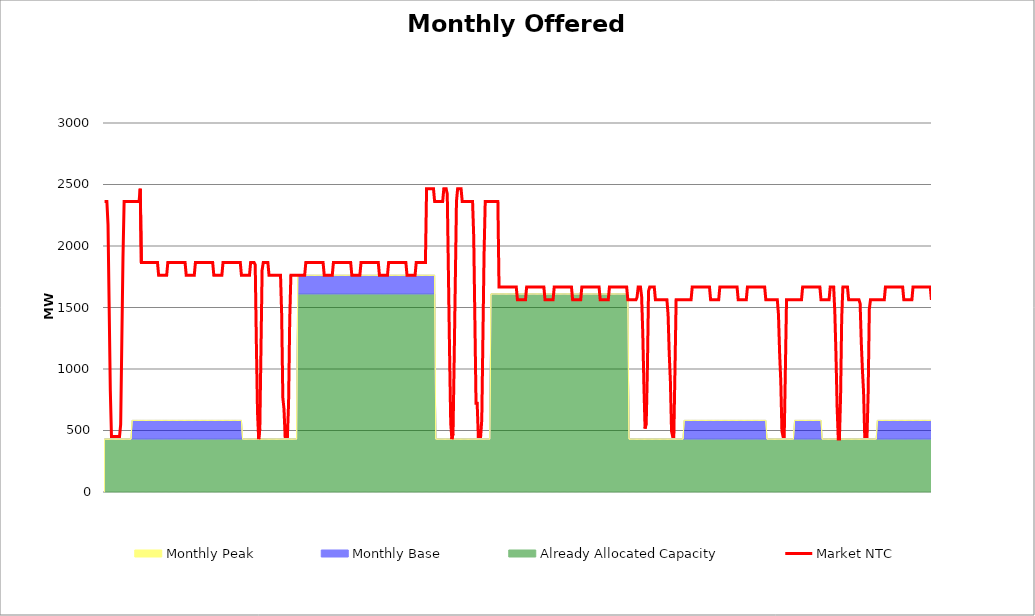
| Category | Market NTC |
|---|---|
| 0 | 2362 |
| 1 | 2362 |
| 2 | 2362 |
| 3 | 2174 |
| 4 | 1497 |
| 5 | 821 |
| 6 | 451 |
| 7 | 451 |
| 8 | 451 |
| 9 | 451 |
| 10 | 451 |
| 11 | 451 |
| 12 | 451 |
| 13 | 451 |
| 14 | 550 |
| 15 | 1227 |
| 16 | 1903 |
| 17 | 2362 |
| 18 | 2362 |
| 19 | 2362 |
| 20 | 2362 |
| 21 | 2362 |
| 22 | 2362 |
| 23 | 2362 |
| 24 | 2362 |
| 25 | 2362 |
| 26 | 2362 |
| 27 | 2362 |
| 28 | 2362 |
| 29 | 2362 |
| 30 | 2362 |
| 31 | 2466 |
| 32 | 1866 |
| 33 | 1866 |
| 34 | 1866 |
| 35 | 1866 |
| 36 | 1866 |
| 37 | 1866 |
| 38 | 1866 |
| 39 | 1866 |
| 40 | 1866 |
| 41 | 1866 |
| 42 | 1866 |
| 43 | 1866 |
| 44 | 1866 |
| 45 | 1866 |
| 46 | 1866 |
| 47 | 1762 |
| 48 | 1762 |
| 49 | 1762 |
| 50 | 1762 |
| 51 | 1762 |
| 52 | 1762 |
| 53 | 1762 |
| 54 | 1762 |
| 55 | 1866 |
| 56 | 1866 |
| 57 | 1866 |
| 58 | 1866 |
| 59 | 1866 |
| 60 | 1866 |
| 61 | 1866 |
| 62 | 1866 |
| 63 | 1866 |
| 64 | 1866 |
| 65 | 1866 |
| 66 | 1866 |
| 67 | 1866 |
| 68 | 1866 |
| 69 | 1866 |
| 70 | 1866 |
| 71 | 1762 |
| 72 | 1762 |
| 73 | 1762 |
| 74 | 1762 |
| 75 | 1762 |
| 76 | 1762 |
| 77 | 1762 |
| 78 | 1762 |
| 79 | 1866 |
| 80 | 1866 |
| 81 | 1866 |
| 82 | 1866 |
| 83 | 1866 |
| 84 | 1866 |
| 85 | 1866 |
| 86 | 1866 |
| 87 | 1866 |
| 88 | 1866 |
| 89 | 1866 |
| 90 | 1866 |
| 91 | 1866 |
| 92 | 1866 |
| 93 | 1866 |
| 94 | 1866 |
| 95 | 1762 |
| 96 | 1762 |
| 97 | 1762 |
| 98 | 1762 |
| 99 | 1762 |
| 100 | 1762 |
| 101 | 1762 |
| 102 | 1762 |
| 103 | 1866 |
| 104 | 1866 |
| 105 | 1866 |
| 106 | 1866 |
| 107 | 1866 |
| 108 | 1866 |
| 109 | 1866 |
| 110 | 1866 |
| 111 | 1866 |
| 112 | 1866 |
| 113 | 1866 |
| 114 | 1866 |
| 115 | 1866 |
| 116 | 1866 |
| 117 | 1866 |
| 118 | 1866 |
| 119 | 1762 |
| 120 | 1762 |
| 121 | 1762 |
| 122 | 1762 |
| 123 | 1762 |
| 124 | 1762 |
| 125 | 1762 |
| 126 | 1762 |
| 127 | 1866 |
| 128 | 1866 |
| 129 | 1866 |
| 130 | 1866 |
| 131 | 1848 |
| 132 | 1203 |
| 133 | 645 |
| 134 | 430 |
| 135 | 516 |
| 136 | 1160 |
| 137 | 1805 |
| 138 | 1866 |
| 139 | 1866 |
| 140 | 1866 |
| 141 | 1866 |
| 142 | 1866 |
| 143 | 1762 |
| 144 | 1762 |
| 145 | 1762 |
| 146 | 1762 |
| 147 | 1762 |
| 148 | 1762 |
| 149 | 1762 |
| 150 | 1762 |
| 151 | 1762 |
| 152 | 1762 |
| 153 | 1762 |
| 154 | 1443 |
| 155 | 767 |
| 156 | 676 |
| 157 | 451 |
| 158 | 451 |
| 159 | 451 |
| 160 | 721 |
| 161 | 1398 |
| 162 | 1762 |
| 163 | 1762 |
| 164 | 1762 |
| 165 | 1762 |
| 166 | 1762 |
| 167 | 1762 |
| 168 | 1762 |
| 169 | 1762 |
| 170 | 1762 |
| 171 | 1762 |
| 172 | 1762 |
| 173 | 1762 |
| 174 | 1762 |
| 175 | 1866 |
| 176 | 1866 |
| 177 | 1866 |
| 178 | 1866 |
| 179 | 1866 |
| 180 | 1866 |
| 181 | 1866 |
| 182 | 1866 |
| 183 | 1866 |
| 184 | 1866 |
| 185 | 1866 |
| 186 | 1866 |
| 187 | 1866 |
| 188 | 1866 |
| 189 | 1866 |
| 190 | 1866 |
| 191 | 1762 |
| 192 | 1762 |
| 193 | 1762 |
| 194 | 1762 |
| 195 | 1762 |
| 196 | 1762 |
| 197 | 1762 |
| 198 | 1762 |
| 199 | 1866 |
| 200 | 1866 |
| 201 | 1866 |
| 202 | 1866 |
| 203 | 1866 |
| 204 | 1866 |
| 205 | 1866 |
| 206 | 1866 |
| 207 | 1866 |
| 208 | 1866 |
| 209 | 1866 |
| 210 | 1866 |
| 211 | 1866 |
| 212 | 1866 |
| 213 | 1866 |
| 214 | 1866 |
| 215 | 1762 |
| 216 | 1762 |
| 217 | 1762 |
| 218 | 1762 |
| 219 | 1762 |
| 220 | 1762 |
| 221 | 1762 |
| 222 | 1762 |
| 223 | 1866 |
| 224 | 1866 |
| 225 | 1866 |
| 226 | 1866 |
| 227 | 1866 |
| 228 | 1866 |
| 229 | 1866 |
| 230 | 1866 |
| 231 | 1866 |
| 232 | 1866 |
| 233 | 1866 |
| 234 | 1866 |
| 235 | 1866 |
| 236 | 1866 |
| 237 | 1866 |
| 238 | 1866 |
| 239 | 1762 |
| 240 | 1762 |
| 241 | 1762 |
| 242 | 1762 |
| 243 | 1762 |
| 244 | 1762 |
| 245 | 1762 |
| 246 | 1762 |
| 247 | 1866 |
| 248 | 1866 |
| 249 | 1866 |
| 250 | 1866 |
| 251 | 1866 |
| 252 | 1866 |
| 253 | 1866 |
| 254 | 1866 |
| 255 | 1866 |
| 256 | 1866 |
| 257 | 1866 |
| 258 | 1866 |
| 259 | 1866 |
| 260 | 1866 |
| 261 | 1866 |
| 262 | 1866 |
| 263 | 1762 |
| 264 | 1762 |
| 265 | 1762 |
| 266 | 1762 |
| 267 | 1762 |
| 268 | 1762 |
| 269 | 1762 |
| 270 | 1762 |
| 271 | 1866 |
| 272 | 1866 |
| 273 | 1866 |
| 274 | 1866 |
| 275 | 1866 |
| 276 | 1866 |
| 277 | 1866 |
| 278 | 1866 |
| 279 | 1866 |
| 280 | 2466 |
| 281 | 2466 |
| 282 | 2466 |
| 283 | 2466 |
| 284 | 2466 |
| 285 | 2466 |
| 286 | 2466 |
| 287 | 2362 |
| 288 | 2362 |
| 289 | 2362 |
| 290 | 2362 |
| 291 | 2362 |
| 292 | 2362 |
| 293 | 2362 |
| 294 | 2362 |
| 295 | 2466 |
| 296 | 2466 |
| 297 | 2466 |
| 298 | 2422 |
| 299 | 1777 |
| 300 | 1133 |
| 301 | 559 |
| 302 | 430 |
| 303 | 473 |
| 304 | 1075 |
| 305 | 1719 |
| 306 | 2364 |
| 307 | 2466 |
| 308 | 2466 |
| 309 | 2466 |
| 310 | 2466 |
| 311 | 2362 |
| 312 | 2362 |
| 313 | 2362 |
| 314 | 2362 |
| 315 | 2362 |
| 316 | 2362 |
| 317 | 2362 |
| 318 | 2362 |
| 319 | 2362 |
| 320 | 2362 |
| 321 | 2074 |
| 322 | 1398 |
| 323 | 721 |
| 324 | 721 |
| 325 | 451 |
| 326 | 451 |
| 327 | 451 |
| 328 | 586 |
| 329 | 1263 |
| 330 | 1939 |
| 331 | 2362 |
| 332 | 2362 |
| 333 | 2362 |
| 334 | 2362 |
| 335 | 2362 |
| 336 | 2362 |
| 337 | 2362 |
| 338 | 2362 |
| 339 | 2362 |
| 340 | 2362 |
| 341 | 2362 |
| 342 | 2362 |
| 343 | 1666 |
| 344 | 1666 |
| 345 | 1666 |
| 346 | 1666 |
| 347 | 1666 |
| 348 | 1666 |
| 349 | 1666 |
| 350 | 1666 |
| 351 | 1666 |
| 352 | 1666 |
| 353 | 1666 |
| 354 | 1666 |
| 355 | 1666 |
| 356 | 1666 |
| 357 | 1666 |
| 358 | 1666 |
| 359 | 1562 |
| 360 | 1562 |
| 361 | 1562 |
| 362 | 1562 |
| 363 | 1562 |
| 364 | 1562 |
| 365 | 1562 |
| 366 | 1562 |
| 367 | 1666 |
| 368 | 1666 |
| 369 | 1666 |
| 370 | 1666 |
| 371 | 1666 |
| 372 | 1666 |
| 373 | 1666 |
| 374 | 1666 |
| 375 | 1666 |
| 376 | 1666 |
| 377 | 1666 |
| 378 | 1666 |
| 379 | 1666 |
| 380 | 1666 |
| 381 | 1666 |
| 382 | 1666 |
| 383 | 1562 |
| 384 | 1562 |
| 385 | 1562 |
| 386 | 1562 |
| 387 | 1562 |
| 388 | 1562 |
| 389 | 1562 |
| 390 | 1562 |
| 391 | 1666 |
| 392 | 1666 |
| 393 | 1666 |
| 394 | 1666 |
| 395 | 1666 |
| 396 | 1666 |
| 397 | 1666 |
| 398 | 1666 |
| 399 | 1666 |
| 400 | 1666 |
| 401 | 1666 |
| 402 | 1666 |
| 403 | 1666 |
| 404 | 1666 |
| 405 | 1666 |
| 406 | 1666 |
| 407 | 1562 |
| 408 | 1562 |
| 409 | 1562 |
| 410 | 1562 |
| 411 | 1562 |
| 412 | 1562 |
| 413 | 1562 |
| 414 | 1562 |
| 415 | 1666 |
| 416 | 1666 |
| 417 | 1666 |
| 418 | 1666 |
| 419 | 1666 |
| 420 | 1666 |
| 421 | 1666 |
| 422 | 1666 |
| 423 | 1666 |
| 424 | 1666 |
| 425 | 1666 |
| 426 | 1666 |
| 427 | 1666 |
| 428 | 1666 |
| 429 | 1666 |
| 430 | 1666 |
| 431 | 1562 |
| 432 | 1562 |
| 433 | 1562 |
| 434 | 1562 |
| 435 | 1562 |
| 436 | 1562 |
| 437 | 1562 |
| 438 | 1562 |
| 439 | 1666 |
| 440 | 1666 |
| 441 | 1666 |
| 442 | 1666 |
| 443 | 1666 |
| 444 | 1666 |
| 445 | 1666 |
| 446 | 1666 |
| 447 | 1666 |
| 448 | 1666 |
| 449 | 1666 |
| 450 | 1666 |
| 451 | 1666 |
| 452 | 1666 |
| 453 | 1666 |
| 454 | 1666 |
| 455 | 1562 |
| 456 | 1562 |
| 457 | 1562 |
| 458 | 1562 |
| 459 | 1562 |
| 460 | 1562 |
| 461 | 1562 |
| 462 | 1562 |
| 463 | 1582 |
| 464 | 1666 |
| 465 | 1666 |
| 466 | 1666 |
| 467 | 1590 |
| 468 | 1289 |
| 469 | 860 |
| 470 | 516 |
| 471 | 559 |
| 472 | 989 |
| 473 | 1633 |
| 474 | 1666 |
| 475 | 1666 |
| 476 | 1666 |
| 477 | 1666 |
| 478 | 1666 |
| 479 | 1562 |
| 480 | 1562 |
| 481 | 1562 |
| 482 | 1562 |
| 483 | 1562 |
| 484 | 1562 |
| 485 | 1562 |
| 486 | 1562 |
| 487 | 1562 |
| 488 | 1562 |
| 489 | 1562 |
| 490 | 1443 |
| 491 | 1127 |
| 492 | 902 |
| 493 | 496 |
| 494 | 451 |
| 495 | 451 |
| 496 | 992 |
| 497 | 1562 |
| 498 | 1562 |
| 499 | 1562 |
| 500 | 1562 |
| 501 | 1562 |
| 502 | 1562 |
| 503 | 1562 |
| 504 | 1562 |
| 505 | 1562 |
| 506 | 1562 |
| 507 | 1562 |
| 508 | 1562 |
| 509 | 1562 |
| 510 | 1562 |
| 511 | 1666 |
| 512 | 1666 |
| 513 | 1666 |
| 514 | 1666 |
| 515 | 1666 |
| 516 | 1666 |
| 517 | 1666 |
| 518 | 1666 |
| 519 | 1666 |
| 520 | 1666 |
| 521 | 1666 |
| 522 | 1666 |
| 523 | 1666 |
| 524 | 1666 |
| 525 | 1666 |
| 526 | 1666 |
| 527 | 1562 |
| 528 | 1562 |
| 529 | 1562 |
| 530 | 1562 |
| 531 | 1562 |
| 532 | 1562 |
| 533 | 1562 |
| 534 | 1562 |
| 535 | 1666 |
| 536 | 1666 |
| 537 | 1666 |
| 538 | 1666 |
| 539 | 1666 |
| 540 | 1666 |
| 541 | 1666 |
| 542 | 1666 |
| 543 | 1666 |
| 544 | 1666 |
| 545 | 1666 |
| 546 | 1666 |
| 547 | 1666 |
| 548 | 1666 |
| 549 | 1666 |
| 550 | 1666 |
| 551 | 1562 |
| 552 | 1562 |
| 553 | 1562 |
| 554 | 1562 |
| 555 | 1562 |
| 556 | 1562 |
| 557 | 1562 |
| 558 | 1562 |
| 559 | 1666 |
| 560 | 1666 |
| 561 | 1666 |
| 562 | 1666 |
| 563 | 1666 |
| 564 | 1666 |
| 565 | 1666 |
| 566 | 1666 |
| 567 | 1666 |
| 568 | 1666 |
| 569 | 1666 |
| 570 | 1666 |
| 571 | 1666 |
| 572 | 1666 |
| 573 | 1666 |
| 574 | 1666 |
| 575 | 1562 |
| 576 | 1562 |
| 577 | 1562 |
| 578 | 1562 |
| 579 | 1562 |
| 580 | 1562 |
| 581 | 1562 |
| 582 | 1562 |
| 583 | 1562 |
| 584 | 1562 |
| 585 | 1562 |
| 586 | 1443 |
| 587 | 1127 |
| 588 | 902 |
| 589 | 496 |
| 590 | 451 |
| 591 | 451 |
| 592 | 992 |
| 593 | 1562 |
| 594 | 1562 |
| 595 | 1562 |
| 596 | 1562 |
| 597 | 1562 |
| 598 | 1562 |
| 599 | 1562 |
| 600 | 1562 |
| 601 | 1562 |
| 602 | 1562 |
| 603 | 1562 |
| 604 | 1562 |
| 605 | 1562 |
| 606 | 1562 |
| 607 | 1666 |
| 608 | 1666 |
| 609 | 1666 |
| 610 | 1666 |
| 611 | 1666 |
| 612 | 1666 |
| 613 | 1666 |
| 614 | 1666 |
| 615 | 1666 |
| 616 | 1666 |
| 617 | 1666 |
| 618 | 1666 |
| 619 | 1666 |
| 620 | 1666 |
| 621 | 1666 |
| 622 | 1666 |
| 623 | 1562 |
| 624 | 1562 |
| 625 | 1562 |
| 626 | 1562 |
| 627 | 1562 |
| 628 | 1562 |
| 629 | 1562 |
| 630 | 1562 |
| 631 | 1666 |
| 632 | 1666 |
| 633 | 1666 |
| 634 | 1666 |
| 635 | 1461 |
| 636 | 1117 |
| 637 | 688 |
| 638 | 430 |
| 639 | 430 |
| 640 | 774 |
| 641 | 1418 |
| 642 | 1666 |
| 643 | 1666 |
| 644 | 1666 |
| 645 | 1666 |
| 646 | 1666 |
| 647 | 1562 |
| 648 | 1562 |
| 649 | 1562 |
| 650 | 1562 |
| 651 | 1562 |
| 652 | 1562 |
| 653 | 1562 |
| 654 | 1562 |
| 655 | 1562 |
| 656 | 1562 |
| 657 | 1533 |
| 658 | 1218 |
| 659 | 992 |
| 660 | 812 |
| 661 | 451 |
| 662 | 451 |
| 663 | 451 |
| 664 | 812 |
| 665 | 1488 |
| 666 | 1562 |
| 667 | 1562 |
| 668 | 1562 |
| 669 | 1562 |
| 670 | 1562 |
| 671 | 1562 |
| 672 | 1562 |
| 673 | 1562 |
| 674 | 1562 |
| 675 | 1562 |
| 676 | 1562 |
| 677 | 1562 |
| 678 | 1562 |
| 679 | 1666 |
| 680 | 1666 |
| 681 | 1666 |
| 682 | 1666 |
| 683 | 1666 |
| 684 | 1666 |
| 685 | 1666 |
| 686 | 1666 |
| 687 | 1666 |
| 688 | 1666 |
| 689 | 1666 |
| 690 | 1666 |
| 691 | 1666 |
| 692 | 1666 |
| 693 | 1666 |
| 694 | 1666 |
| 695 | 1562 |
| 696 | 1562 |
| 697 | 1562 |
| 698 | 1562 |
| 699 | 1562 |
| 700 | 1562 |
| 701 | 1562 |
| 702 | 1562 |
| 703 | 1666 |
| 704 | 1666 |
| 705 | 1666 |
| 706 | 1666 |
| 707 | 1666 |
| 708 | 1666 |
| 709 | 1666 |
| 710 | 1666 |
| 711 | 1666 |
| 712 | 1666 |
| 713 | 1666 |
| 714 | 1666 |
| 715 | 1666 |
| 716 | 1666 |
| 717 | 1666 |
| 718 | 1666 |
| 719 | 1562 |